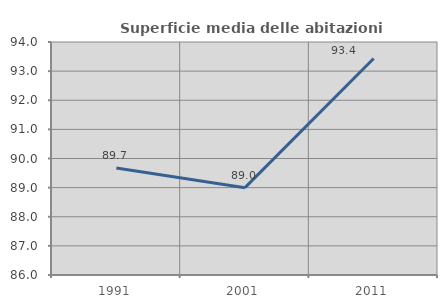
| Category | Superficie media delle abitazioni occupate |
|---|---|
| 1991.0 | 89.674 |
| 2001.0 | 88.999 |
| 2011.0 | 93.435 |